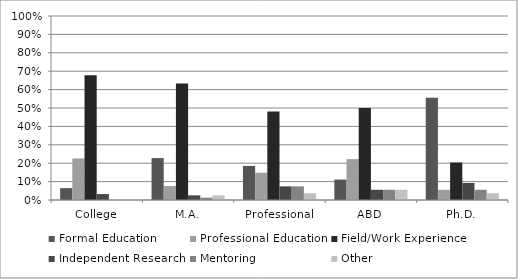
| Category | Formal Education | Professional Education | Field/Work Experience | Independent Research | Mentoring | Other |
|---|---|---|---|---|---|---|
| College | 0.065 | 0.226 | 0.677 | 0.032 | 0 | 0 |
| M.A. | 0.228 | 0.076 | 0.633 | 0.025 | 0.013 | 0.025 |
| Professional | 0.185 | 0.148 | 0.481 | 0.074 | 0.074 | 0.037 |
| ABD | 0.111 | 0.222 | 0.5 | 0.056 | 0.056 | 0.056 |
| Ph.D. | 0.556 | 0.056 | 0.204 | 0.093 | 0.056 | 0.037 |